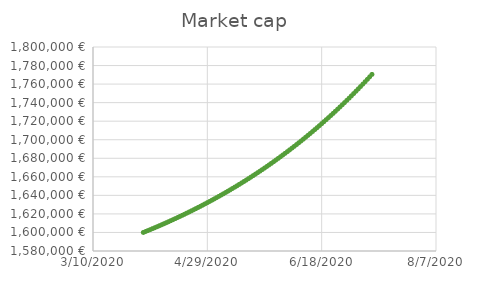
| Category | Market cap |
|---|---|
| 43922.0 | 1600000 |
| 43923.0 | 1601000 |
| 43924.0 | 1602010 |
| 43925.0 | 1603030.1 |
| 43926.0 | 1604060.401 |
| 43927.0 | 1605101.005 |
| 43928.0 | 1606152.015 |
| 43929.0 | 1607213.535 |
| 43930.0 | 1608285.671 |
| 43931.0 | 1609368.527 |
| 43932.0 | 1610462.213 |
| 43933.0 | 1611566.835 |
| 43934.0 | 1612682.503 |
| 43935.0 | 1613809.328 |
| 43936.0 | 1614947.421 |
| 43937.0 | 1616096.896 |
| 43938.0 | 1617257.864 |
| 43939.0 | 1618430.443 |
| 43940.0 | 1619614.748 |
| 43941.0 | 1620810.895 |
| 43942.0 | 1622019.004 |
| 43943.0 | 1623239.194 |
| 43944.0 | 1624471.586 |
| 43945.0 | 1625716.302 |
| 43946.0 | 1626973.465 |
| 43947.0 | 1628243.2 |
| 43948.0 | 1629525.631 |
| 43949.0 | 1630820.888 |
| 43950.0 | 1632129.097 |
| 43951.0 | 1633450.388 |
| 43952.0 | 1634784.892 |
| 43953.0 | 1636132.74 |
| 43954.0 | 1637494.068 |
| 43955.0 | 1638869.009 |
| 43956.0 | 1640257.699 |
| 43957.0 | 1641660.276 |
| 43958.0 | 1643076.878 |
| 43959.0 | 1644507.647 |
| 43960.0 | 1645952.724 |
| 43961.0 | 1647412.251 |
| 43962.0 | 1648886.373 |
| 43963.0 | 1650375.237 |
| 43964.0 | 1651878.989 |
| 43965.0 | 1653397.779 |
| 43966.0 | 1654931.757 |
| 43967.0 | 1656481.075 |
| 43968.0 | 1658045.885 |
| 43969.0 | 1659626.344 |
| 43970.0 | 1661222.608 |
| 43971.0 | 1662834.834 |
| 43972.0 | 1664463.182 |
| 43973.0 | 1666107.814 |
| 43974.0 | 1667768.892 |
| 43975.0 | 1669446.581 |
| 43976.0 | 1671141.047 |
| 43977.0 | 1672852.457 |
| 43978.0 | 1674580.982 |
| 43979.0 | 1676326.792 |
| 43980.0 | 1678090.06 |
| 43981.0 | 1679870.96 |
| 43982.0 | 1681669.67 |
| 43983.0 | 1683486.367 |
| 43984.0 | 1685321.23 |
| 43985.0 | 1687174.443 |
| 43986.0 | 1689046.187 |
| 43987.0 | 1690936.649 |
| 43988.0 | 1692846.015 |
| 43989.0 | 1694774.475 |
| 43990.0 | 1696722.22 |
| 43991.0 | 1698689.442 |
| 43992.0 | 1700676.337 |
| 43993.0 | 1702683.1 |
| 43994.0 | 1704709.931 |
| 43995.0 | 1706757.031 |
| 43996.0 | 1708824.601 |
| 43997.0 | 1710912.847 |
| 43998.0 | 1713021.975 |
| 43999.0 | 1715152.195 |
| 44000.0 | 1717303.717 |
| 44001.0 | 1719476.754 |
| 44002.0 | 1721671.522 |
| 44003.0 | 1723888.237 |
| 44004.0 | 1726127.119 |
| 44005.0 | 1728388.39 |
| 44006.0 | 1730672.274 |
| 44007.0 | 1732978.997 |
| 44008.0 | 1735308.787 |
| 44009.0 | 1737661.875 |
| 44010.0 | 1740038.494 |
| 44011.0 | 1742438.879 |
| 44012.0 | 1744863.267 |
| 44013.0 | 1747311.9 |
| 44014.0 | 1749785.019 |
| 44015.0 | 1752282.869 |
| 44016.0 | 1754805.698 |
| 44017.0 | 1757353.755 |
| 44018.0 | 1759927.293 |
| 44019.0 | 1762526.565 |
| 44020.0 | 1765151.831 |
| 44021.0 | 1767803.349 |
| 44022.0 | 1770481.383 |